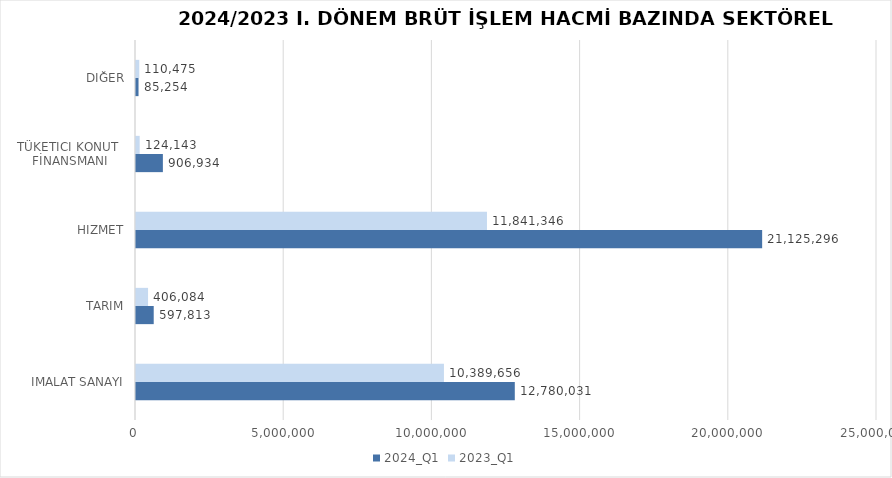
| Category | 2024_Q1 | 2023_Q1 |
|---|---|---|
| İMALAT SANAYİ | 12780030.739 | 10389655.7 |
| TARIM | 597812.929 | 406084.149 |
| HİZMET | 21125296.029 | 11841346.272 |
| TÜKETİCİ KONUT 
FİNANSMANI | 906934 | 124143 |
| DİĞER | 85254 | 110475 |